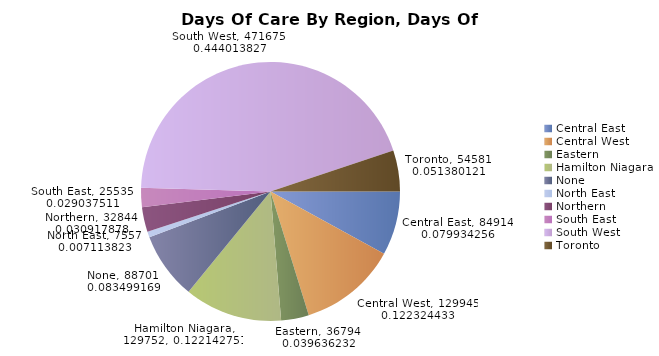
| Category | Days Of Service |
|---|---|
| Central East | 84914 |
| Central West | 129945 |
| Eastern | 36794 |
| Hamilton Niagara | 129752 |
| None | 88701 |
| North East | 7557 |
| Northern | 32844 |
| South East | 25535 |
| South West | 471675 |
| Toronto | 54581 |